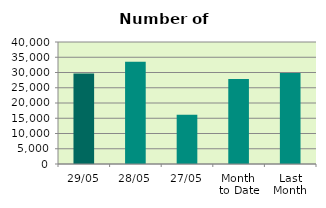
| Category | Series 0 |
|---|---|
| 29/05 | 29668 |
| 28/05 | 33522 |
| 27/05 | 16112 |
| Month 
to Date | 27889.6 |
| Last
Month | 29833 |